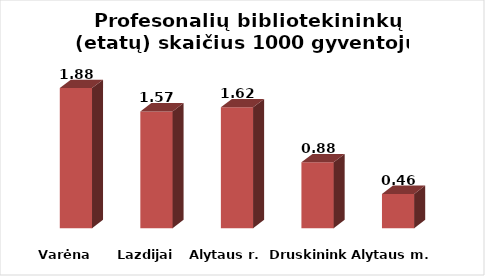
| Category | Series 0 |
|---|---|
| Varėna | 1.879 |
| Lazdijai | 1.565 |
| Alytaus r. | 1.621 |
| Druskininkai | 0.883 |
| Alytaus m. | 0.459 |